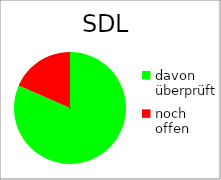
| Category | SDL |
|---|---|
| davon überprüft | 31 |
| noch offen | 7 |